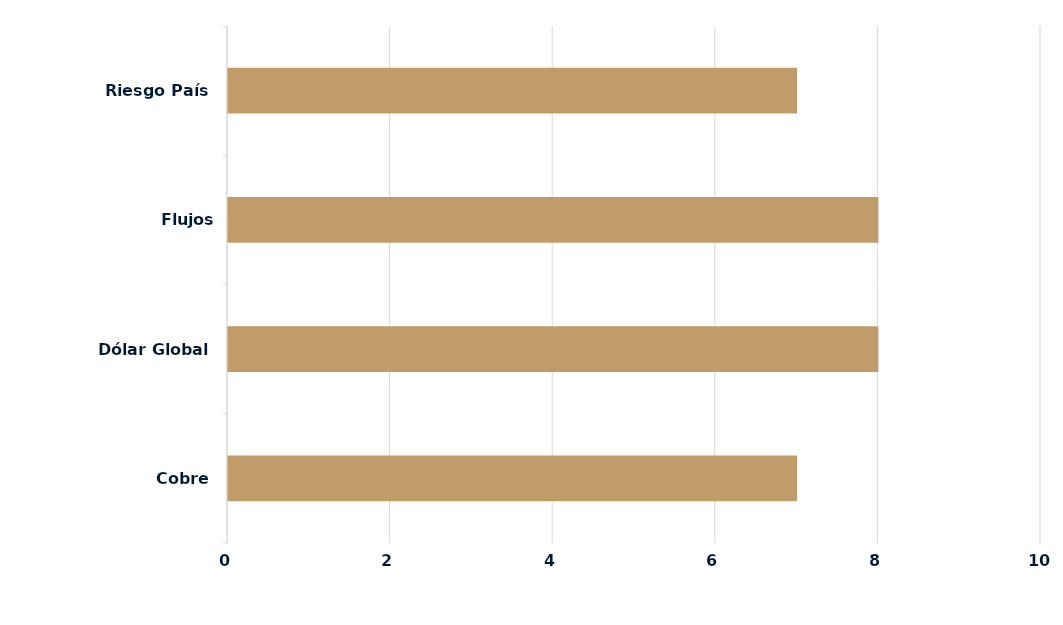
| Category | Series 0 |
|---|---|
| Cobre | 7 |
| Dólar Global | 8 |
| Flujos Locales/Extranjeros | 8 |
| Riesgo País | 7 |